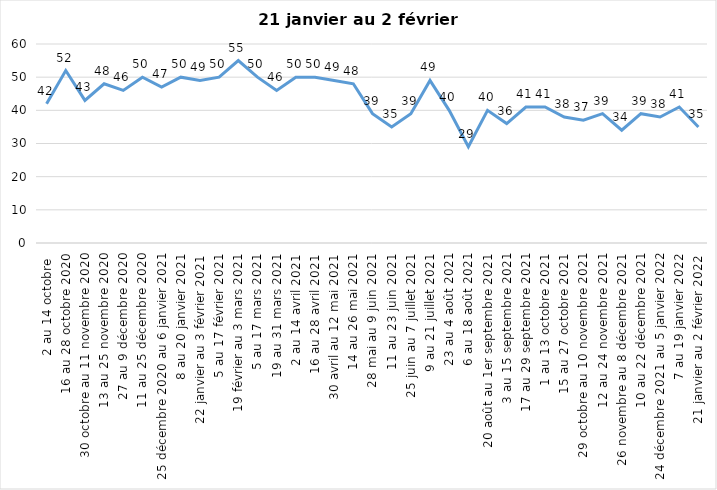
| Category | Toujours aux trois mesures |
|---|---|
| 2 au 14 octobre  | 42 |
| 16 au 28 octobre 2020 | 52 |
| 30 octobre au 11 novembre 2020 | 43 |
| 13 au 25 novembre 2020 | 48 |
| 27 au 9 décembre 2020 | 46 |
| 11 au 25 décembre 2020 | 50 |
| 25 décembre 2020 au 6 janvier 2021 | 47 |
| 8 au 20 janvier 2021 | 50 |
| 22 janvier au 3 février 2021 | 49 |
| 5 au 17 février 2021 | 50 |
| 19 février au 3 mars 2021 | 55 |
| 5 au 17 mars 2021 | 50 |
| 19 au 31 mars 2021 | 46 |
| 2 au 14 avril 2021 | 50 |
| 16 au 28 avril 2021 | 50 |
| 30 avril au 12 mai 2021 | 49 |
| 14 au 26 mai 2021 | 48 |
| 28 mai au 9 juin 2021 | 39 |
| 11 au 23 juin 2021 | 35 |
| 25 juin au 7 juillet 2021 | 39 |
| 9 au 21 juillet 2021 | 49 |
| 23 au 4 août 2021 | 40 |
| 6 au 18 août 2021 | 29 |
| 20 août au 1er septembre 2021 | 40 |
| 3 au 15 septembre 2021 | 36 |
| 17 au 29 septembre 2021 | 41 |
| 1 au 13 octobre 2021 | 41 |
| 15 au 27 octobre 2021 | 38 |
| 29 octobre au 10 novembre 2021 | 37 |
| 12 au 24 novembre 2021 | 39 |
| 26 novembre au 8 décembre 2021 | 34 |
| 10 au 22 décembre 2021 | 39 |
| 24 décembre 2021 au 5 janvier 2022 | 38 |
| 7 au 19 janvier 2022 | 41 |
| 21 janvier au 2 février 2022 | 35 |